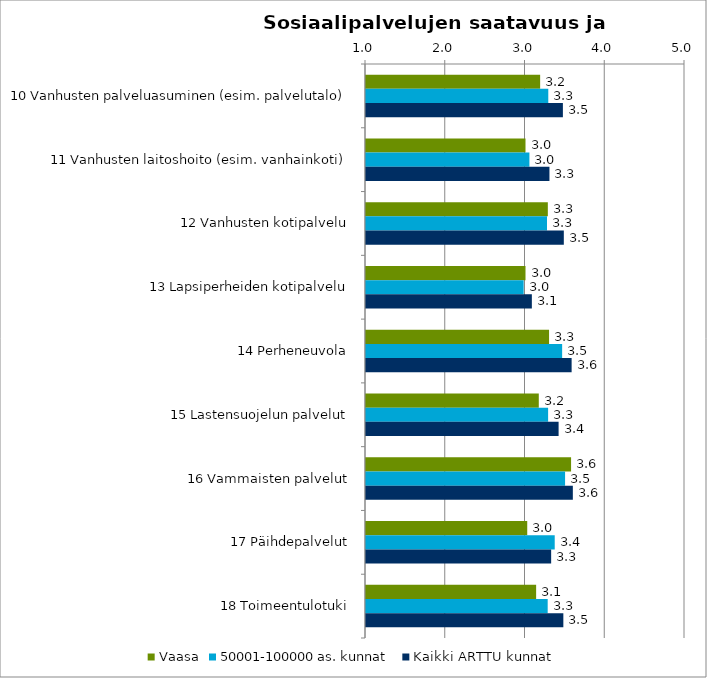
| Category | Vaasa | 50001-100000 as. kunnat | Kaikki ARTTU kunnat |
|---|---|---|---|
| 10 Vanhusten palveluasuminen (esim. palvelutalo) | 3.184 | 3.286 | 3.469 |
| 11 Vanhusten laitoshoito (esim. vanhainkoti) | 3 | 3.049 | 3.3 |
| 12 Vanhusten kotipalvelu | 3.28 | 3.27 | 3.48 |
| 13 Lapsiperheiden kotipalvelu | 3 | 2.977 | 3.08 |
| 14 Perheneuvola | 3.295 | 3.459 | 3.578 |
| 15 Lastensuojelun palvelut | 3.167 | 3.284 | 3.415 |
| 16 Vammaisten palvelut | 3.571 | 3.496 | 3.594 |
| 17 Päihdepalvelut | 3.022 | 3.366 | 3.322 |
| 18 Toimeentulotuki | 3.133 | 3.278 | 3.475 |